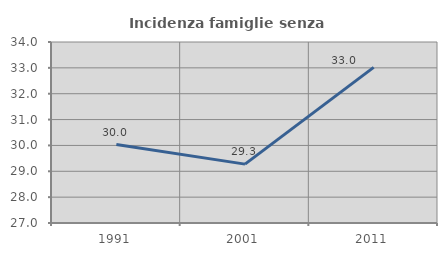
| Category | Incidenza famiglie senza nuclei |
|---|---|
| 1991.0 | 30.033 |
| 2001.0 | 29.276 |
| 2011.0 | 33.019 |